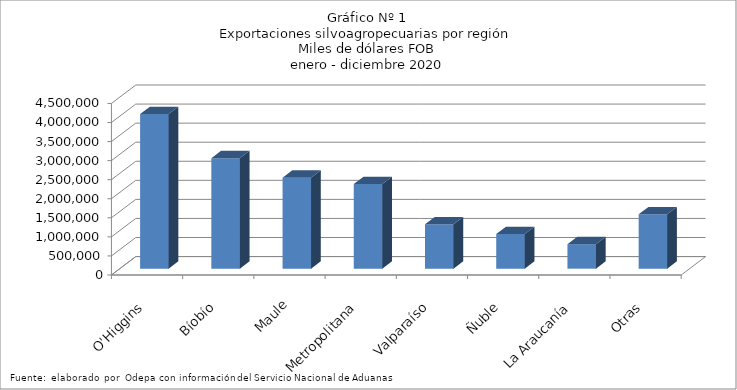
| Category | Series 0 |
|---|---|
| O'Higgins | 4054259.903 |
| Bíobío | 2898762.104 |
| Maule | 2386403.801 |
| Metropolitana | 2218047.375 |
| Valparaíso | 1162872.997 |
| Ñuble | 908591.473 |
| La Araucanía | 642709.156 |
| Otras | 1424794.905 |